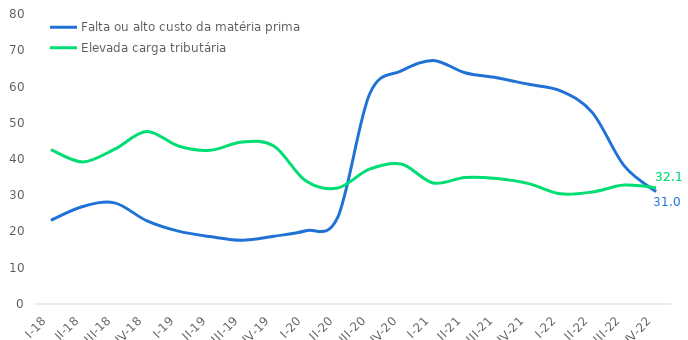
| Category | Falta ou alto custo da matéria prima | Elevada carga tributária |
|---|---|---|
| I-18 | 23.1 | 42.6 |
| II-18 | 26.9 | 39.2 |
| III-18 | 27.9 | 42.7 |
| IV-18 | 23 | 47.6 |
| I-19 | 20.1 | 43.6 |
| II-19 | 18.6 | 42.4 |
| III-19 | 17.6 | 44.7 |
| IV-19 | 18.7 | 43.6 |
| I-20 | 20.2 | 34 |
| II-20 | 23.8 | 32 |
| III-20 | 57.8 | 37.2 |
| IV-20 | 64.3 | 38.6 |
| I-21 | 67.2 | 33.4 |
| II-21 | 63.8 | 34.9 |
| III-21 | 62.4 | 34.6 |
| IV-21 | 60.6 | 33.2 |
| I-22 | 58.8 | 30.4 |
| II-22 | 52.8 | 30.9 |
| III-22 | 38.1 | 32.8 |
| IV-22 | 31 | 32.1 |